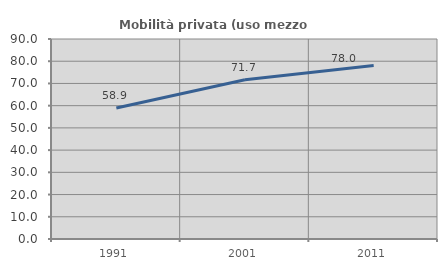
| Category | Mobilità privata (uso mezzo privato) |
|---|---|
| 1991.0 | 58.942 |
| 2001.0 | 71.662 |
| 2011.0 | 78.031 |